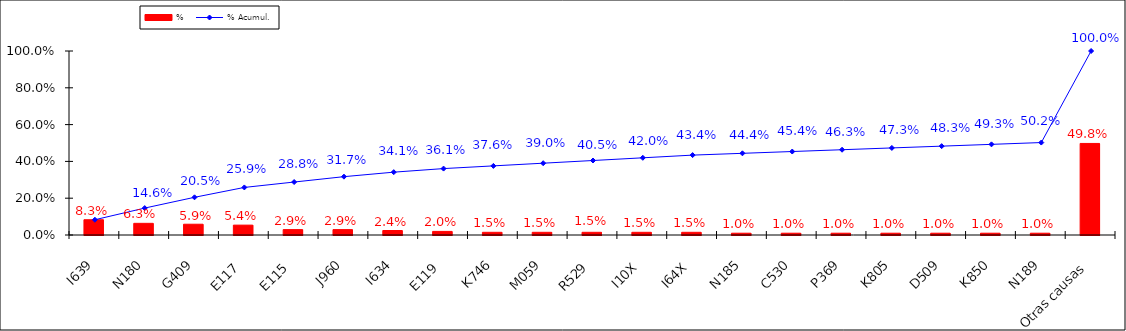
| Category | % |
|---|---|
| I639 | 0.083 |
| N180 | 0.063 |
| G409 | 0.059 |
| E117 | 0.054 |
| E115 | 0.029 |
| J960 | 0.029 |
| I634 | 0.024 |
| E119 | 0.02 |
| K746 | 0.015 |
| M059 | 0.015 |
| R529 | 0.015 |
| I10X | 0.015 |
| I64X | 0.015 |
| N185 | 0.01 |
| C530 | 0.01 |
| P369 | 0.01 |
| K805 | 0.01 |
| D509 | 0.01 |
| K850 | 0.01 |
| N189 | 0.01 |
| Otras causas | 0.498 |